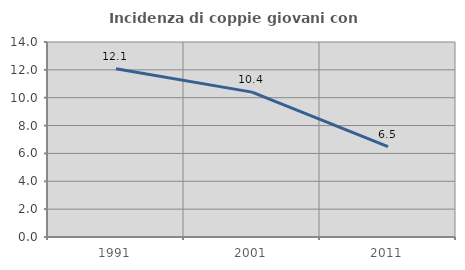
| Category | Incidenza di coppie giovani con figli |
|---|---|
| 1991.0 | 12.072 |
| 2001.0 | 10.401 |
| 2011.0 | 6.483 |